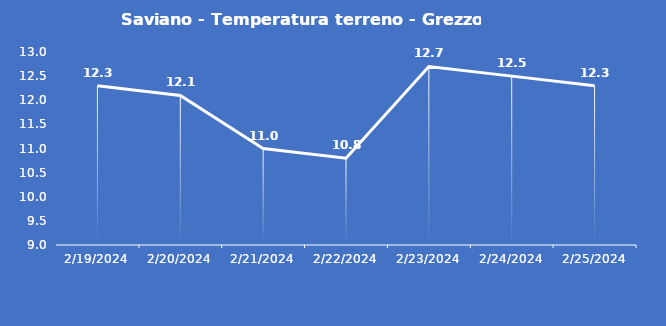
| Category | Saviano - Temperatura terreno - Grezzo (°C) |
|---|---|
| 2/19/24 | 12.3 |
| 2/20/24 | 12.1 |
| 2/21/24 | 11 |
| 2/22/24 | 10.8 |
| 2/23/24 | 12.7 |
| 2/24/24 | 12.5 |
| 2/25/24 | 12.3 |